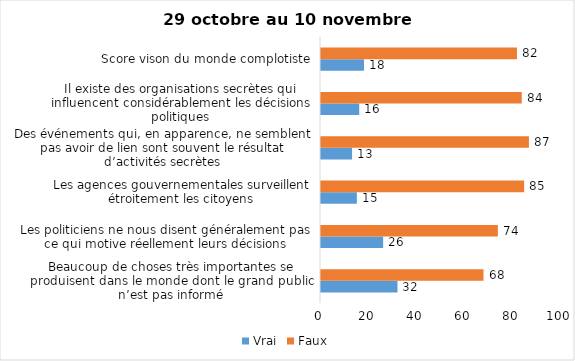
| Category | Vrai | Faux |
|---|---|---|
| Beaucoup de choses très importantes se produisent dans le monde dont le grand public n’est pas informé | 32 | 68 |
| Les politiciens ne nous disent généralement pas ce qui motive réellement leurs décisions | 26 | 74 |
| Les agences gouvernementales surveillent étroitement les citoyens | 15 | 85 |
| Des événements qui, en apparence, ne semblent pas avoir de lien sont souvent le résultat d’activités secrètes | 13 | 87 |
| Il existe des organisations secrètes qui influencent considérablement les décisions politiques | 16 | 84 |
| Score vison du monde complotiste | 18 | 82 |